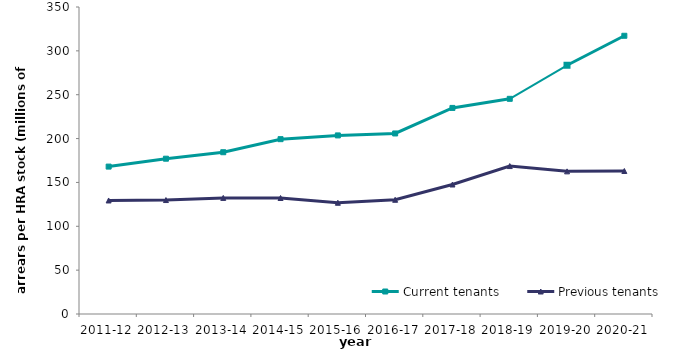
| Category | Current tenants | Previous tenants |
|---|---|---|
| 2011-12 | 168.04 | 129.432 |
| 2012-13 | 177.058 | 129.917 |
| 2013-14 | 184.427 | 132.362 |
| 2014-15 | 199.323 | 132.241 |
| 2015-16 | 203.603 | 126.805 |
| 2016-17 | 205.818 | 130.214 |
| 2017-18 | 234.946 | 147.633 |
| 2018-19 | 245.323 | 168.654 |
| 2019-20 | 283.553 | 162.618 |
| 2020-21 | 317.188 | 163.013 |